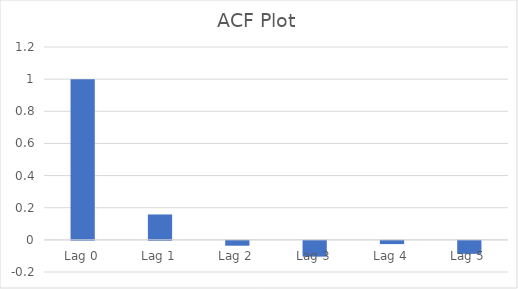
| Category | Series 0 |
|---|---|
| Lag 0 | 1 |
| Lag 1 | 0.158 |
| Lag 2 | -0.03 |
| Lag 3 | -0.098 |
| Lag 4 | -0.02 |
| Lag 5 | -0.081 |